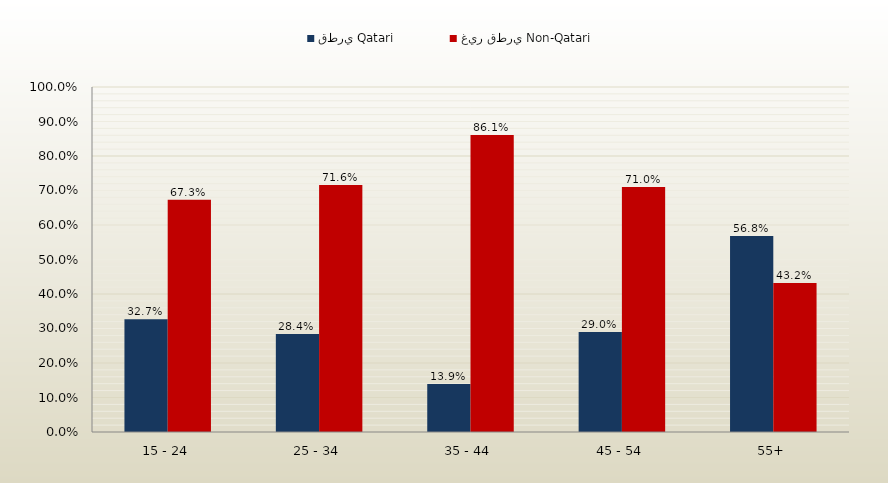
| Category | قطري Qatari | غير قطري Non-Qatari |
|---|---|---|
| 15 - 24 | 0.327 | 0.673 |
| 25 - 34 | 0.284 | 0.716 |
| 35 - 44 | 0.139 | 0.861 |
| 45 - 54 | 0.29 | 0.71 |
| 55+ | 0.568 | 0.432 |